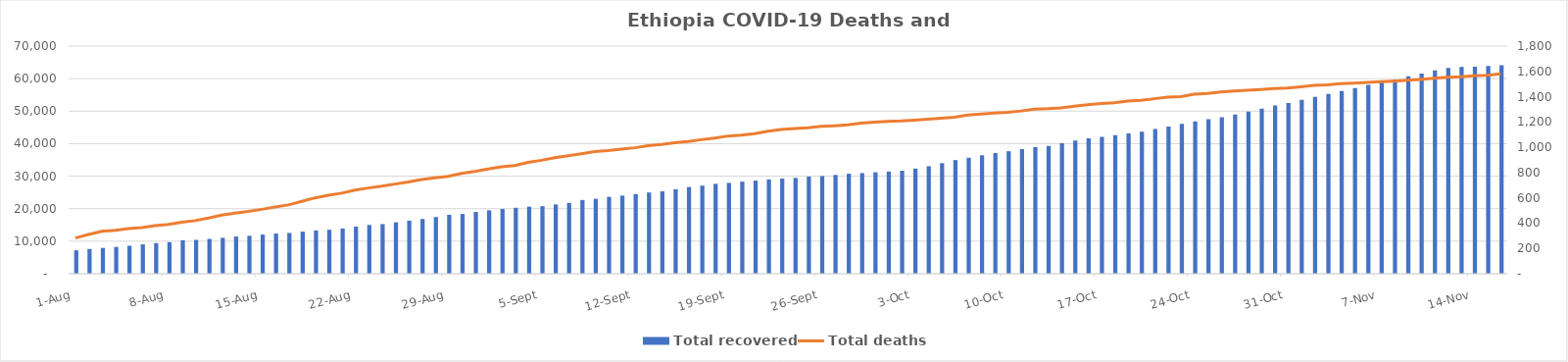
| Category | Total recovered  |
|---|---|
| 2020-11-16 | 64130 |
| 2020-11-15 | 63866 |
| 2020-11-14 | 63675 |
| 2020-11-13 | 63571 |
| 2020-11-12 | 63268 |
| 2020-11-11 | 62497 |
| 2020-11-10 | 61516 |
| 2020-11-09 | 60710 |
| 2020-11-08 | 59766 |
| 2020-11-07 | 58948 |
| 2020-11-06 | 58103 |
| 2020-11-05 | 57114 |
| 2020-11-04 | 56165 |
| 2020-11-03 | 55254 |
| 2020-11-02 | 54405 |
| 2020-11-01 | 53452 |
| 2020-10-31 | 52517 |
| 2020-10-30 | 51713 |
| 2020-10-29 | 50753 |
| 2020-10-28 | 49866 |
| 2020-10-27 | 48968 |
| 2020-10-26 | 48150 |
| 2020-10-25 | 47543 |
| 2020-10-24 | 46842 |
| 2020-10-23 | 46118 |
| 2020-10-22 | 45260 |
| 2020-10-21 | 44506 |
| 2020-10-20 | 43638 |
| 2020-10-19 | 43149 |
| 2020-10-18 | 42649 |
| 2020-10-17 | 42099 |
| 2020-10-16 | 41628 |
| 2020-10-15 | 40988 |
| 2020-10-14 | 40165 |
| 2020-10-13 | 39307 |
| 2020-10-12 | 38904 |
| 2020-10-11 | 38316 |
| 2020-10-10 | 37683 |
| 2020-10-09 | 37102 |
| 2020-10-08 | 36434 |
| 2020-10-07 | 35670 |
| 2020-10-06 | 34960 |
| 2020-10-05 | 34016 |
| 2020-10-04 | 33060 |
| 2020-10-03 | 32325 |
| 2020-10-02 | 31677 |
| 2020-10-01 | 31430 |
| 2020-09-30 | 31204 |
| 2020-09-29 | 30952 |
| 2020-09-28 | 30753 |
| 2020-09-27 | 30363 |
| 2020-09-26 | 30029 |
| 2020-09-25 | 29863 |
| 2020-09-24 | 29461 |
| 2020-09-23 | 29253 |
| 2020-09-22 | 28991 |
| 2020-09-21 | 28634 |
| 2020-09-20 | 28314 |
| 2020-09-19 | 27939 |
| 2020-09-18 | 27638 |
| 2020-09-17 | 27085 |
| 2020-09-16 | 26665 |
| 2020-09-15 | 25988 |
| 2020-09-14 | 25333 |
| 2020-09-13 | 24983 |
| 2020-09-12 | 24493 |
| 2020-09-11 | 24024 |
| 2020-09-10 | 23640 |
| 2020-09-09 | 23054 |
| 2020-09-08 | 22677 |
| 2020-09-07 | 21789 |
| 2020-09-06 | 21307 |
| 2020-09-05 | 20776 |
| 2020-09-04 | 20612 |
| 2020-09-03 | 20283 |
| 2020-09-02 | 19903 |
| 2020-09-01 | 19487 |
| 2020-08-31 | 18994 |
| 2020-08-30 | 18382 |
| 2020-08-29 | 18116 |
| 2020-08-28 | 17415 |
| 2020-08-27 | 16829 |
| 2020-08-26 | 16311 |
| 2020-08-25 | 15796 |
| 2020-08-24 | 15262 |
| 2020-08-23 | 14995 |
| 2020-08-22 | 14480 |
| 2020-08-21 | 13913 |
| 2020-08-20 | 13536 |
| 2020-08-19 | 13308 |
| 2020-08-18 | 12938 |
| 2020-08-17 | 12542 |
| 2020-08-16 | 12359 |
| 2020-08-15 | 12037 |
| 2020-08-14 | 11660 |
| 2020-08-13 | 11428 |
| 2020-08-12 | 11034 |
| 2020-08-11 | 10696 |
| 2020-08-10 | 10411 |
| 2020-08-09 | 10296 |
| 2020-08-08 | 9707 |
| 2020-08-07 | 9415 |
| 2020-08-06 | 9027 |
| 2020-08-05 | 8598 |
| 2020-08-04 | 8240 |
| 2020-08-03 | 7931 |
| 2020-08-02 | 7601 |
| 2020-08-01 | 7195 |